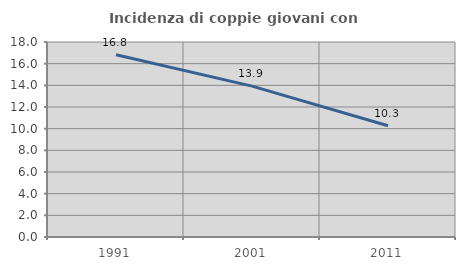
| Category | Incidenza di coppie giovani con figli |
|---|---|
| 1991.0 | 16.827 |
| 2001.0 | 13.924 |
| 2011.0 | 10.264 |